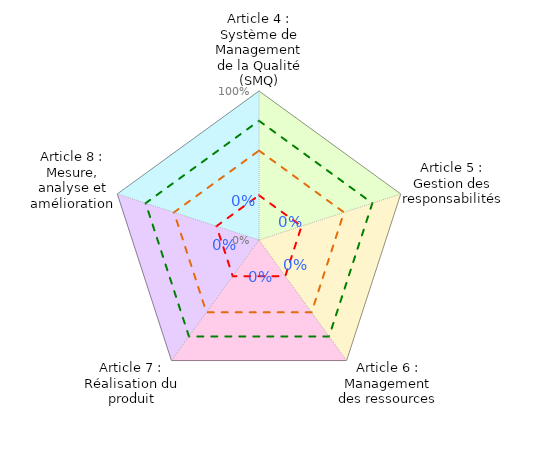
| Category | Coloriage Art4 | Coloriage Art5 | Coloriage Art6 | Coloriage Art7 | Coloriage Art8 | Informel | Convaincant | Conforme | Evaluation Mutuelle |
|---|---|---|---|---|---|---|---|---|---|
| Article 4 : Système de Management de la Qualité (SMQ) | 1 | 0 | 0 | 0 | 1 | 0.3 | 0.6 | 0.8 | 0 |
| Article 5 : Gestion des responsabilités | 1 | 1 | 0 | 0 | 0 | 0.3 | 0.6 | 0.8 | 0 |
| Article 6 : Management des ressources | 0 | 1 | 1 | 0 | 0 | 0.3 | 0.6 | 0.8 | 0 |
| Article 7 : Réalisation du produit | 0 | 0 | 1 | 1 | 0 | 0.3 | 0.6 | 0.8 | 0 |
| Article 8 : Mesure, analyse et amélioration | 0 | 0 | 0 | 1 | 1 | 0.3 | 0.6 | 0.8 | 0 |